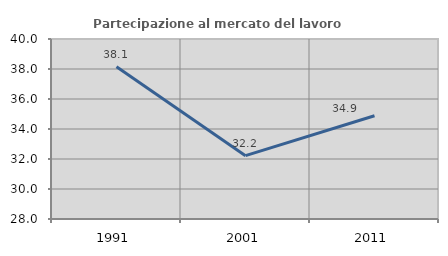
| Category | Partecipazione al mercato del lavoro  femminile |
|---|---|
| 1991.0 | 38.144 |
| 2001.0 | 32.222 |
| 2011.0 | 34.884 |